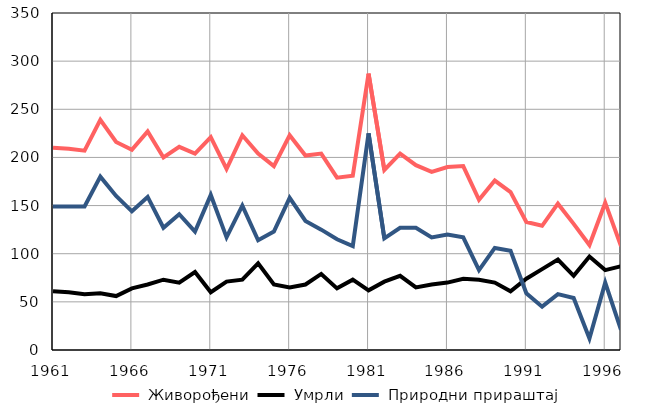
| Category |  Живорођени |  Умрли |  Природни прираштај |
|---|---|---|---|
| 1961.0 | 210 | 61 | 149 |
| 1962.0 | 209 | 60 | 149 |
| 1963.0 | 207 | 58 | 149 |
| 1964.0 | 239 | 59 | 180 |
| 1965.0 | 216 | 56 | 160 |
| 1966.0 | 208 | 64 | 144 |
| 1967.0 | 227 | 68 | 159 |
| 1968.0 | 200 | 73 | 127 |
| 1969.0 | 211 | 70 | 141 |
| 1970.0 | 204 | 81 | 123 |
| 1971.0 | 221 | 60 | 161 |
| 1972.0 | 188 | 71 | 117 |
| 1973.0 | 223 | 73 | 150 |
| 1974.0 | 204 | 90 | 114 |
| 1975.0 | 191 | 68 | 123 |
| 1976.0 | 223 | 65 | 158 |
| 1977.0 | 202 | 68 | 134 |
| 1978.0 | 204 | 79 | 125 |
| 1979.0 | 179 | 64 | 115 |
| 1980.0 | 181 | 73 | 108 |
| 1981.0 | 287 | 62 | 225 |
| 1982.0 | 187 | 71 | 116 |
| 1983.0 | 204 | 77 | 127 |
| 1984.0 | 192 | 65 | 127 |
| 1985.0 | 185 | 68 | 117 |
| 1986.0 | 190 | 70 | 120 |
| 1987.0 | 191 | 74 | 117 |
| 1988.0 | 156 | 73 | 83 |
| 1989.0 | 176 | 70 | 106 |
| 1990.0 | 164 | 61 | 103 |
| 1991.0 | 133 | 74 | 59 |
| 1992.0 | 129 | 84 | 45 |
| 1993.0 | 152 | 94 | 58 |
| 1994.0 | 131 | 77 | 54 |
| 1995.0 | 109 | 97 | 12 |
| 1996.0 | 153 | 83 | 70 |
| 1997.0 | 108 | 87 | 21 |